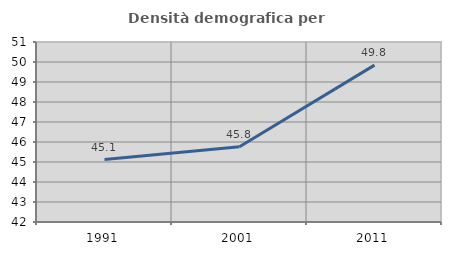
| Category | Densità demografica |
|---|---|
| 1991.0 | 45.119 |
| 2001.0 | 45.766 |
| 2011.0 | 49.845 |